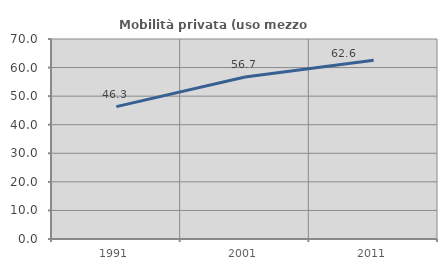
| Category | Mobilità privata (uso mezzo privato) |
|---|---|
| 1991.0 | 46.34 |
| 2001.0 | 56.702 |
| 2011.0 | 62.577 |